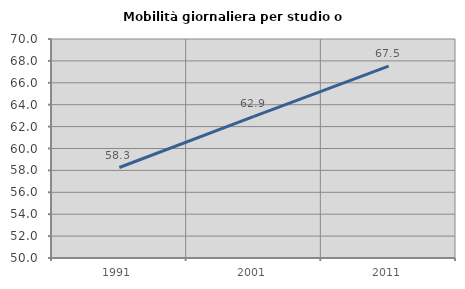
| Category | Mobilità giornaliera per studio o lavoro |
|---|---|
| 1991.0 | 58.262 |
| 2001.0 | 62.928 |
| 2011.0 | 67.525 |